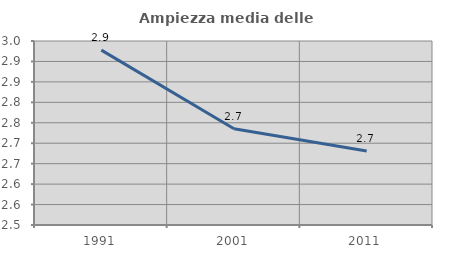
| Category | Ampiezza media delle famiglie |
|---|---|
| 1991.0 | 2.928 |
| 2001.0 | 2.735 |
| 2011.0 | 2.681 |